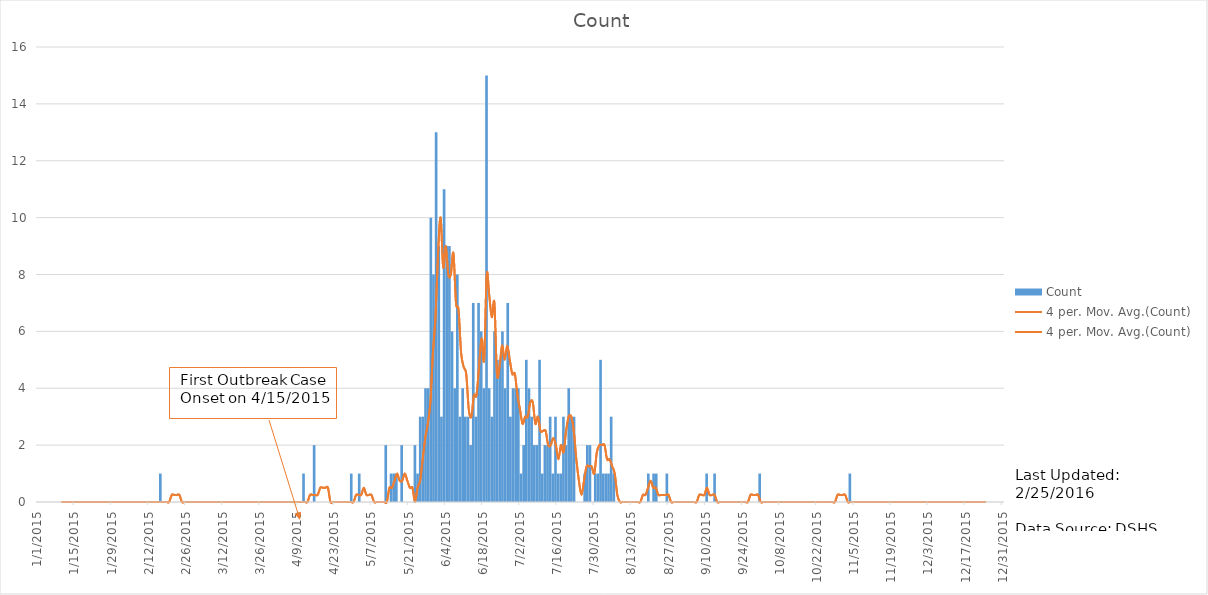
| Category | Count |
|---|---|
| 1/1/15 | 0 |
| 1/2/15 | 0 |
| 1/3/15 | 0 |
| 1/4/15 | 0 |
| 1/5/15 | 0 |
| 1/6/15 | 0 |
| 1/7/15 | 0 |
| 1/8/15 | 0 |
| 1/9/15 | 0 |
| 1/10/15 | 0 |
| 1/11/15 | 0 |
| 1/12/15 | 0 |
| 1/13/15 | 0 |
| 1/14/15 | 0 |
| 1/15/15 | 0 |
| 1/16/15 | 0 |
| 1/17/15 | 0 |
| 1/18/15 | 0 |
| 1/19/15 | 0 |
| 1/20/15 | 0 |
| 1/21/15 | 0 |
| 1/22/15 | 0 |
| 1/23/15 | 0 |
| 1/24/15 | 0 |
| 1/25/15 | 0 |
| 1/26/15 | 0 |
| 1/27/15 | 0 |
| 1/28/15 | 0 |
| 1/29/15 | 0 |
| 1/30/15 | 0 |
| 1/31/15 | 0 |
| 2/1/15 | 0 |
| 2/2/15 | 0 |
| 2/3/15 | 0 |
| 2/4/15 | 0 |
| 2/5/15 | 0 |
| 2/6/15 | 0 |
| 2/7/15 | 0 |
| 2/8/15 | 0 |
| 2/9/15 | 0 |
| 2/10/15 | 0 |
| 2/11/15 | 0 |
| 2/12/15 | 0 |
| 2/13/15 | 0 |
| 2/14/15 | 0 |
| 2/15/15 | 0 |
| 2/16/15 | 1 |
| 2/17/15 | 0 |
| 2/18/15 | 0 |
| 2/19/15 | 0 |
| 2/20/15 | 0 |
| 2/21/15 | 0 |
| 2/22/15 | 0 |
| 2/23/15 | 0 |
| 2/24/15 | 0 |
| 2/25/15 | 0 |
| 2/26/15 | 0 |
| 2/27/15 | 0 |
| 2/28/15 | 0 |
| 3/1/15 | 0 |
| 3/2/15 | 0 |
| 3/3/15 | 0 |
| 3/4/15 | 0 |
| 3/5/15 | 0 |
| 3/6/15 | 0 |
| 3/7/15 | 0 |
| 3/8/15 | 0 |
| 3/9/15 | 0 |
| 3/10/15 | 0 |
| 3/11/15 | 0 |
| 3/12/15 | 0 |
| 3/13/15 | 0 |
| 3/14/15 | 0 |
| 3/15/15 | 0 |
| 3/16/15 | 0 |
| 3/17/15 | 0 |
| 3/18/15 | 0 |
| 3/19/15 | 0 |
| 3/20/15 | 0 |
| 3/21/15 | 0 |
| 3/22/15 | 0 |
| 3/23/15 | 0 |
| 3/24/15 | 0 |
| 3/25/15 | 0 |
| 3/26/15 | 0 |
| 3/27/15 | 0 |
| 3/28/15 | 0 |
| 3/29/15 | 0 |
| 3/30/15 | 0 |
| 3/31/15 | 0 |
| 4/1/15 | 0 |
| 4/2/15 | 0 |
| 4/3/15 | 0 |
| 4/4/15 | 0 |
| 4/5/15 | 0 |
| 4/6/15 | 0 |
| 4/7/15 | 0 |
| 4/8/15 | 0 |
| 4/9/15 | 0 |
| 4/10/15 | 0 |
| 4/11/15 | 1 |
| 4/12/15 | 0 |
| 4/13/15 | 0 |
| 4/14/15 | 0 |
| 4/15/15 | 2 |
| 4/16/15 | 0 |
| 4/17/15 | 0 |
| 4/18/15 | 0 |
| 4/19/15 | 0 |
| 4/20/15 | 0 |
| 4/21/15 | 0 |
| 4/22/15 | 0 |
| 4/23/15 | 0 |
| 4/24/15 | 0 |
| 4/25/15 | 0 |
| 4/26/15 | 0 |
| 4/27/15 | 0 |
| 4/28/15 | 0 |
| 4/29/15 | 1 |
| 4/30/15 | 0 |
| 5/1/15 | 0 |
| 5/2/15 | 1 |
| 5/3/15 | 0 |
| 5/4/15 | 0 |
| 5/5/15 | 0 |
| 5/6/15 | 0 |
| 5/7/15 | 0 |
| 5/8/15 | 0 |
| 5/9/15 | 0 |
| 5/10/15 | 0 |
| 5/11/15 | 0 |
| 5/12/15 | 2 |
| 5/13/15 | 0 |
| 5/14/15 | 1 |
| 5/15/15 | 1 |
| 5/16/15 | 1 |
| 5/17/15 | 0 |
| 5/18/15 | 2 |
| 5/19/15 | 0 |
| 5/20/15 | 0 |
| 5/21/15 | 0 |
| 5/22/15 | 0 |
| 5/23/15 | 2 |
| 5/24/15 | 1 |
| 5/25/15 | 3 |
| 5/26/15 | 3 |
| 5/27/15 | 4 |
| 5/28/15 | 4 |
| 5/29/15 | 10 |
| 5/30/15 | 8 |
| 5/31/15 | 13 |
| 6/1/15 | 9 |
| 6/2/15 | 3 |
| 6/3/15 | 11 |
| 6/4/15 | 9 |
| 6/5/15 | 9 |
| 6/6/15 | 6 |
| 6/7/15 | 4 |
| 6/8/15 | 8 |
| 6/9/15 | 3 |
| 6/10/15 | 4 |
| 6/11/15 | 3 |
| 6/12/15 | 3 |
| 6/13/15 | 2 |
| 6/14/15 | 7 |
| 6/15/15 | 3 |
| 6/16/15 | 7 |
| 6/17/15 | 6 |
| 6/18/15 | 4 |
| 6/19/15 | 15 |
| 6/20/15 | 4 |
| 6/21/15 | 3 |
| 6/22/15 | 6 |
| 6/23/15 | 5 |
| 6/24/15 | 5 |
| 6/25/15 | 6 |
| 6/26/15 | 4 |
| 6/27/15 | 7 |
| 6/28/15 | 3 |
| 6/29/15 | 4 |
| 6/30/15 | 4 |
| 7/1/15 | 4 |
| 7/2/15 | 1 |
| 7/3/15 | 2 |
| 7/4/15 | 5 |
| 7/5/15 | 4 |
| 7/6/15 | 3 |
| 7/7/15 | 2 |
| 7/8/15 | 2 |
| 7/9/15 | 5 |
| 7/10/15 | 1 |
| 7/11/15 | 2 |
| 7/12/15 | 2 |
| 7/13/15 | 3 |
| 7/14/15 | 1 |
| 7/15/15 | 3 |
| 7/16/15 | 1 |
| 7/17/15 | 1 |
| 7/18/15 | 3 |
| 7/19/15 | 2 |
| 7/20/15 | 4 |
| 7/21/15 | 3 |
| 7/22/15 | 3 |
| 7/23/15 | 0 |
| 7/24/15 | 0 |
| 7/25/15 | 0 |
| 7/26/15 | 1 |
| 7/27/15 | 2 |
| 7/28/15 | 2 |
| 7/29/15 | 0 |
| 7/30/15 | 1 |
| 7/31/15 | 1 |
| 8/1/15 | 5 |
| 8/2/15 | 1 |
| 8/3/15 | 1 |
| 8/4/15 | 1 |
| 8/5/15 | 3 |
| 8/6/15 | 1 |
| 8/7/15 | 0 |
| 8/8/15 | 0 |
| 8/9/15 | 0 |
| 8/10/15 | 0 |
| 8/11/15 | 0 |
| 8/12/15 | 0 |
| 8/13/15 | 0 |
| 8/14/15 | 0 |
| 8/15/15 | 0 |
| 8/16/15 | 0 |
| 8/17/15 | 0 |
| 8/18/15 | 0 |
| 8/19/15 | 1 |
| 8/20/15 | 0 |
| 8/21/15 | 1 |
| 8/22/15 | 1 |
| 8/23/15 | 0 |
| 8/24/15 | 0 |
| 8/25/15 | 0 |
| 8/26/15 | 1 |
| 8/27/15 | 0 |
| 8/28/15 | 0 |
| 8/29/15 | 0 |
| 8/30/15 | 0 |
| 8/31/15 | 0 |
| 9/1/15 | 0 |
| 9/2/15 | 0 |
| 9/3/15 | 0 |
| 9/4/15 | 0 |
| 9/5/15 | 0 |
| 9/6/15 | 0 |
| 9/7/15 | 0 |
| 9/8/15 | 0 |
| 9/9/15 | 0 |
| 9/10/15 | 1 |
| 9/11/15 | 0 |
| 9/12/15 | 0 |
| 9/13/15 | 1 |
| 9/14/15 | 0 |
| 9/15/15 | 0 |
| 9/16/15 | 0 |
| 9/17/15 | 0 |
| 9/18/15 | 0 |
| 9/19/15 | 0 |
| 9/20/15 | 0 |
| 9/21/15 | 0 |
| 9/22/15 | 0 |
| 9/23/15 | 0 |
| 9/24/15 | 0 |
| 9/25/15 | 0 |
| 9/26/15 | 0 |
| 9/27/15 | 0 |
| 9/28/15 | 0 |
| 9/29/15 | 0 |
| 9/30/15 | 1 |
| 10/1/15 | 0 |
| 10/2/15 | 0 |
| 10/3/15 | 0 |
| 10/4/15 | 0 |
| 10/5/15 | 0 |
| 10/6/15 | 0 |
| 10/7/15 | 0 |
| 10/8/15 | 0 |
| 10/9/15 | 0 |
| 10/10/15 | 0 |
| 10/11/15 | 0 |
| 10/12/15 | 0 |
| 10/13/15 | 0 |
| 10/14/15 | 0 |
| 10/15/15 | 0 |
| 10/16/15 | 0 |
| 10/17/15 | 0 |
| 10/18/15 | 0 |
| 10/19/15 | 0 |
| 10/20/15 | 0 |
| 10/21/15 | 0 |
| 10/22/15 | 0 |
| 10/23/15 | 0 |
| 10/24/15 | 0 |
| 10/25/15 | 0 |
| 10/26/15 | 0 |
| 10/27/15 | 0 |
| 10/28/15 | 0 |
| 10/29/15 | 0 |
| 10/30/15 | 0 |
| 10/31/15 | 0 |
| 11/1/15 | 0 |
| 11/2/15 | 0 |
| 11/3/15 | 1 |
| 11/4/15 | 0 |
| 11/5/15 | 0 |
| 11/6/15 | 0 |
| 11/7/15 | 0 |
| 11/8/15 | 0 |
| 11/9/15 | 0 |
| 11/10/15 | 0 |
| 11/11/15 | 0 |
| 11/12/15 | 0 |
| 11/13/15 | 0 |
| 11/14/15 | 0 |
| 11/15/15 | 0 |
| 11/16/15 | 0 |
| 11/17/15 | 0 |
| 11/18/15 | 0 |
| 11/19/15 | 0 |
| 11/20/15 | 0 |
| 11/21/15 | 0 |
| 11/22/15 | 0 |
| 11/23/15 | 0 |
| 11/24/15 | 0 |
| 11/25/15 | 0 |
| 11/26/15 | 0 |
| 11/27/15 | 0 |
| 11/28/15 | 0 |
| 11/29/15 | 0 |
| 11/30/15 | 0 |
| 12/1/15 | 0 |
| 12/2/15 | 0 |
| 12/3/15 | 0 |
| 12/4/15 | 0 |
| 12/5/15 | 0 |
| 12/6/15 | 0 |
| 12/7/15 | 0 |
| 12/8/15 | 0 |
| 12/9/15 | 0 |
| 12/10/15 | 0 |
| 12/11/15 | 0 |
| 12/12/15 | 0 |
| 12/13/15 | 0 |
| 12/14/15 | 0 |
| 12/15/15 | 0 |
| 12/16/15 | 0 |
| 12/17/15 | 0 |
| 12/18/15 | 0 |
| 12/19/15 | 0 |
| 12/20/15 | 0 |
| 12/21/15 | 0 |
| 12/22/15 | 0 |
| 12/23/15 | 0 |
| 12/24/15 | 0 |
| 12/25/15 | 0 |
| 12/26/15 | 0 |
| 12/27/15 | 0 |
| 12/28/15 | 0 |
| 12/29/15 | 0 |
| 12/30/15 | 0 |
| 12/31/15 | 0 |